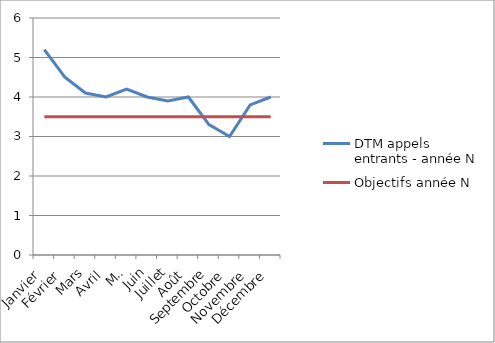
| Category | DTM appels entrants - année N | Objectifs année N |
|---|---|---|
| Janvier | 5.2 | 3.5 |
| Février | 4.5 | 3.5 |
| Mars | 4.1 | 3.5 |
| Avril | 4 | 3.5 |
| Mai | 4.2 | 3.5 |
| Juin | 4 | 3.5 |
| Juillet | 3.9 | 3.5 |
| Août | 4 | 3.5 |
| Septembre | 3.3 | 3.5 |
| Octobre | 3 | 3.5 |
| Novembre | 3.8 | 3.5 |
| Décembre | 4 | 3.5 |